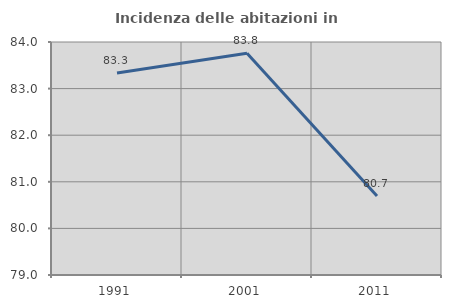
| Category | Incidenza delle abitazioni in proprietà  |
|---|---|
| 1991.0 | 83.333 |
| 2001.0 | 83.758 |
| 2011.0 | 80.697 |